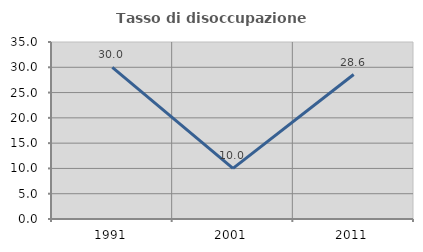
| Category | Tasso di disoccupazione giovanile  |
|---|---|
| 1991.0 | 30 |
| 2001.0 | 10 |
| 2011.0 | 28.571 |